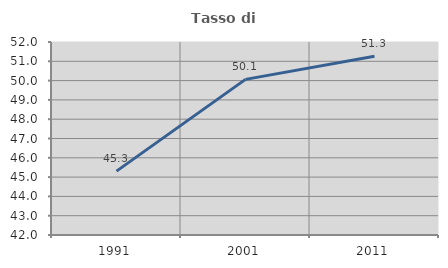
| Category | Tasso di occupazione   |
|---|---|
| 1991.0 | 45.31 |
| 2001.0 | 50.062 |
| 2011.0 | 51.267 |